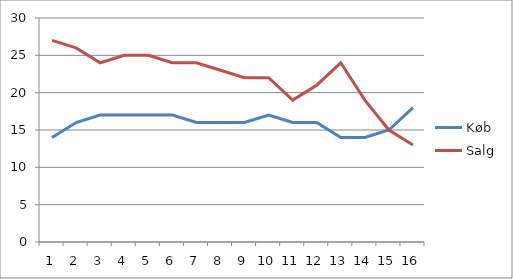
| Category | Køb | Salg |
|---|---|---|
| 0 | 14 | 27 |
| 1 | 16 | 26 |
| 2 | 17 | 24 |
| 3 | 17 | 25 |
| 4 | 17 | 25 |
| 5 | 17 | 24 |
| 6 | 16 | 24 |
| 7 | 16 | 23 |
| 8 | 16 | 22 |
| 9 | 17 | 22 |
| 10 | 16 | 19 |
| 11 | 16 | 21 |
| 12 | 14 | 24 |
| 13 | 14 | 19 |
| 14 | 15 | 15 |
| 15 | 18 | 13 |